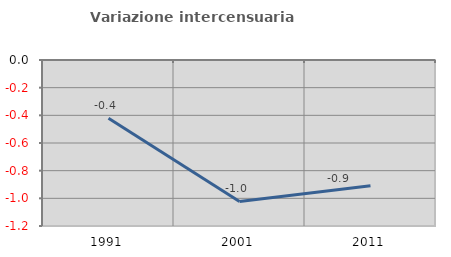
| Category | Variazione intercensuaria annua |
|---|---|
| 1991.0 | -0.421 |
| 2001.0 | -1.023 |
| 2011.0 | -0.909 |